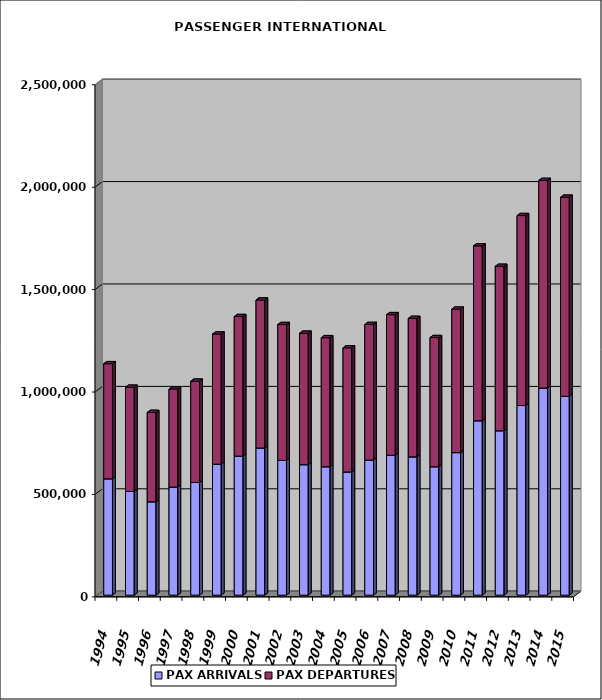
| Category | PAX ARRIVALS | PAX DEPARTURES |
|---|---|---|
| 1994.0 | 568140 | 561912 |
| 1995.0 | 505998 | 509150 |
| 1996.0 | 455760 | 436394 |
| 1997.0 | 527897 | 478527 |
| 1998.0 | 550053 | 494551 |
| 1999.0 | 639461 | 635195 |
| 2000.0 | 678663 | 681617 |
| 2001.0 | 718555 | 722431 |
| 2002.0 | 657980 | 663119 |
| 2003.0 | 637073 | 641789 |
| 2004.0 | 627019 | 629922 |
| 2005.0 | 601732 | 605966 |
| 2006.0 | 659545 | 661962 |
| 2007.0 | 682749 | 686661 |
| 2008.0 | 675183 | 675994 |
| 2009.0 | 627120 | 630479 |
| 2010.0 | 695937 | 700246 |
| 2011.0 | 851489 | 853813 |
| 2012.0 | 802760 | 802698 |
| 2013.0 | 925834 | 927362 |
| 2014.0 | 1011367 | 1013347 |
| 2015.0 | 970662 | 972198 |